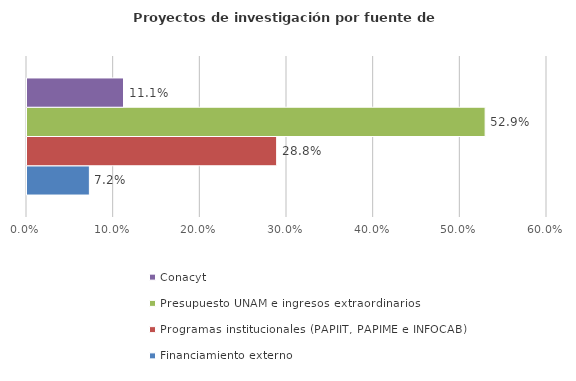
| Category | Financiamiento externo | Programas institucionales (PAPIIT, PAPIME e INFOCAB) | Presupuesto UNAM e ingresos extraordinarios | Conacyt |
|---|---|---|---|---|
| 0 | 0.072 | 0.288 | 0.529 | 0.111 |